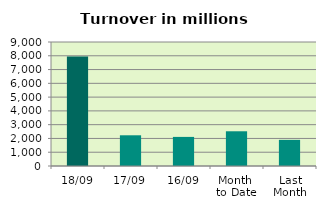
| Category | Series 0 |
|---|---|
| 18/09 | 7951.016 |
| 17/09 | 2229.16 |
| 16/09 | 2111.393 |
| Month 
to Date | 2520.257 |
| Last
Month | 1896.825 |